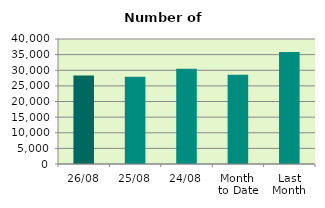
| Category | Series 0 |
|---|---|
| 26/08 | 28334 |
| 25/08 | 27908 |
| 24/08 | 30504 |
| Month 
to Date | 28530.947 |
| Last
Month | 35875.545 |